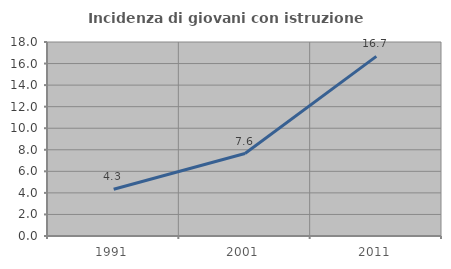
| Category | Incidenza di giovani con istruzione universitaria |
|---|---|
| 1991.0 | 4.34 |
| 2001.0 | 7.648 |
| 2011.0 | 16.667 |